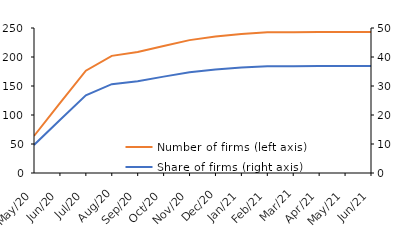
| Category | Number of firms (left axis) |
|---|---|
| 2020-05-01 | 63.798 |
| 2020-06-01 | 120.662 |
| 2020-07-01 | 176.433 |
| 2020-08-01 | 201.963 |
| 2020-09-01 | 208.497 |
| 2020-10-01 | 219.014 |
| 2020-11-01 | 229.079 |
| 2020-12-01 | 235.245 |
| 2021-01-01 | 239.804 |
| 2021-02-01 | 242.61 |
| 2021-03-01 | 242.811 |
| 2021-04-01 | 242.935 |
| 2021-05-01 | 242.945 |
| 2021-06-01 | 242.954 |